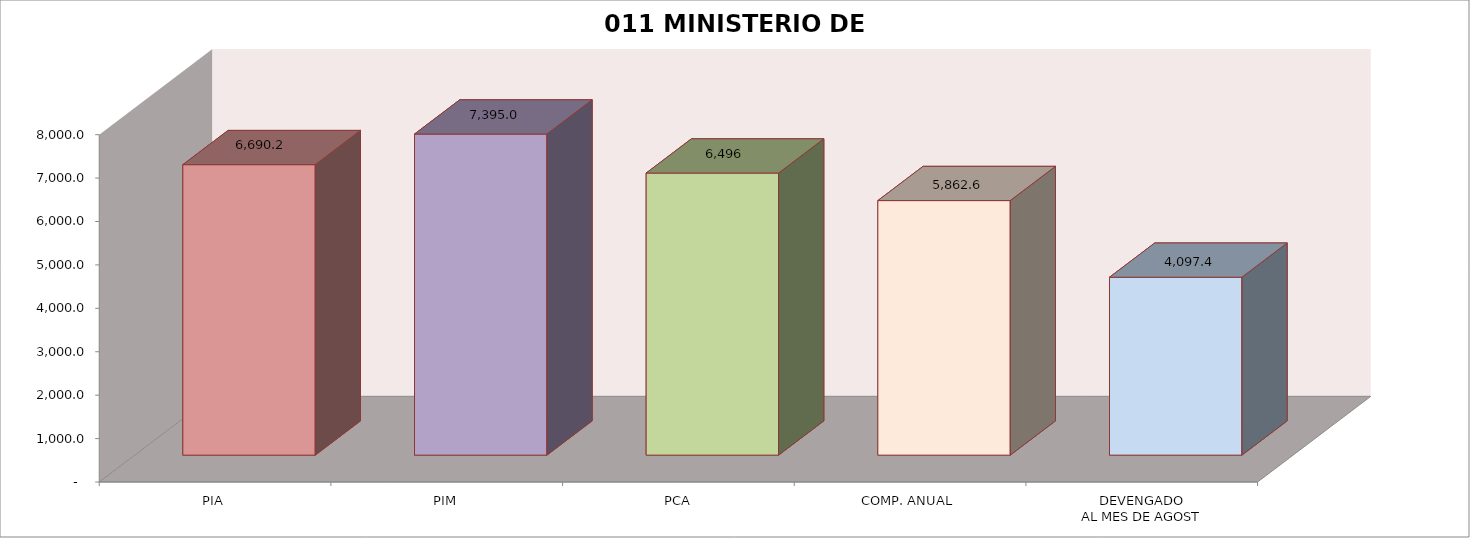
| Category | 011 MINISTERIO DE SALUD |
|---|---|
| PIA | 6690.187 |
| PIM | 7395.019 |
| PCA | 6496.497 |
| COMP. ANUAL | 5862.636 |
| DEVENGADO
AL MES DE AGOST | 4097.392 |